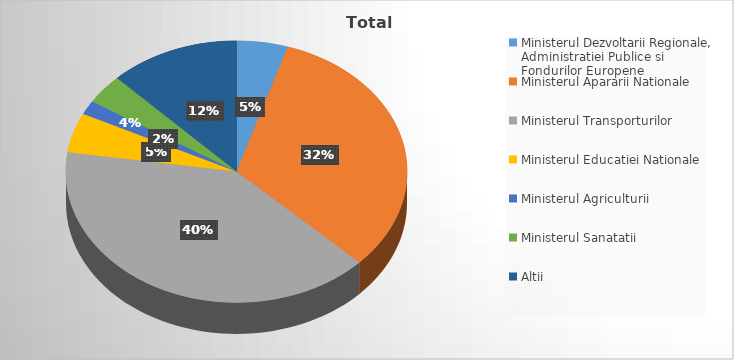
| Category | Series 0 |
|---|---|
| Ministerul Dezvoltarii Regionale, Administratiei Publice si Fondurilor Europene | 4.837 |
| Ministerul Apararii Nationale | 32.388 |
| Ministerul Transporturilor | 40.131 |
| Ministerul Educatiei Nationale | 4.906 |
| Ministerul Agriculturii | 1.721 |
| Ministerul Sanatatii | 3.692 |
| Altii | 12.326 |